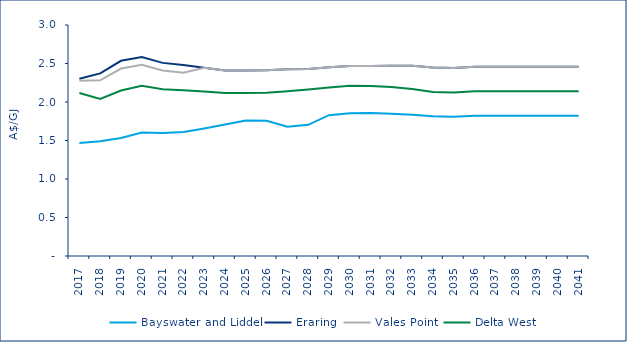
| Category | Bayswater and Liddel | Eraring | Vales Point | Delta West |
|---|---|---|---|---|
| 2017.0 | 1.466 | 2.303 | 2.275 | 2.118 |
| 2018.0 | 1.491 | 2.372 | 2.282 | 2.041 |
| 2019.0 | 1.532 | 2.535 | 2.435 | 2.149 |
| 2020.0 | 1.605 | 2.584 | 2.484 | 2.211 |
| 2021.0 | 1.597 | 2.508 | 2.408 | 2.166 |
| 2022.0 | 1.611 | 2.479 | 2.379 | 2.151 |
| 2023.0 | 1.657 | 2.445 | 2.445 | 2.137 |
| 2024.0 | 1.707 | 2.409 | 2.409 | 2.117 |
| 2025.0 | 1.761 | 2.409 | 2.409 | 2.118 |
| 2026.0 | 1.756 | 2.412 | 2.412 | 2.12 |
| 2027.0 | 1.678 | 2.426 | 2.426 | 2.141 |
| 2028.0 | 1.704 | 2.43 | 2.43 | 2.161 |
| 2029.0 | 1.829 | 2.451 | 2.451 | 2.187 |
| 2030.0 | 1.854 | 2.469 | 2.469 | 2.211 |
| 2031.0 | 1.858 | 2.467 | 2.467 | 2.208 |
| 2032.0 | 1.846 | 2.47 | 2.47 | 2.196 |
| 2033.0 | 1.834 | 2.47 | 2.47 | 2.168 |
| 2034.0 | 1.814 | 2.447 | 2.447 | 2.131 |
| 2035.0 | 1.809 | 2.441 | 2.441 | 2.125 |
| 2036.0 | 1.822 | 2.458 | 2.458 | 2.14 |
| 2037.0 | 1.822 | 2.458 | 2.458 | 2.14 |
| 2038.0 | 1.822 | 2.458 | 2.458 | 2.14 |
| 2039.0 | 1.822 | 2.458 | 2.458 | 2.14 |
| 2040.0 | 1.822 | 2.458 | 2.458 | 2.14 |
| 2041.0 | 1.822 | 2.458 | 2.458 | 2.14 |